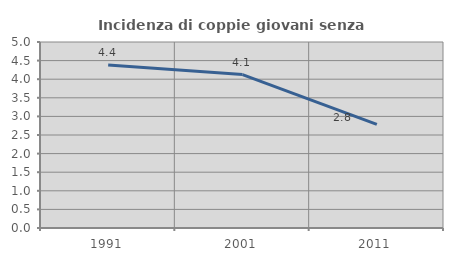
| Category | Incidenza di coppie giovani senza figli |
|---|---|
| 1991.0 | 4.382 |
| 2001.0 | 4.124 |
| 2011.0 | 2.787 |